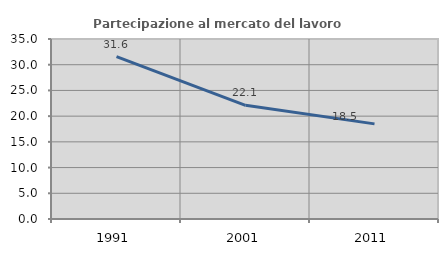
| Category | Partecipazione al mercato del lavoro  femminile |
|---|---|
| 1991.0 | 31.59 |
| 2001.0 | 22.101 |
| 2011.0 | 18.495 |